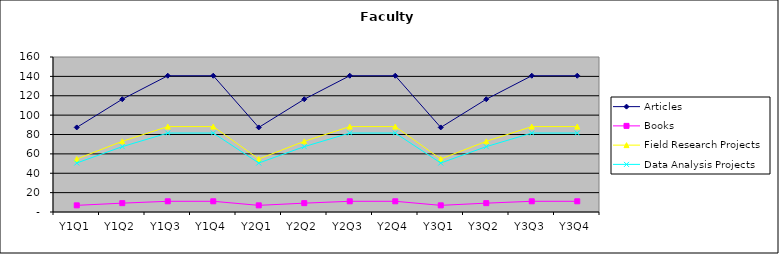
| Category | Articles  | Books  | Field Research Projects | Data Analysis Projects |
|---|---|---|---|---|
| Y1Q1 | 87.3 | 6.858 | 54.72 | 50.58 |
| Y1Q2 | 116.4 | 9.144 | 72.96 | 67.44 |
| Y1Q3 | 140.65 | 11.049 | 88.16 | 81.49 |
| Y1Q4 | 140.65 | 11.049 | 88.16 | 81.49 |
| Y2Q1 | 87.3 | 6.858 | 54.72 | 50.58 |
| Y2Q2 | 116.4 | 9.144 | 72.96 | 67.44 |
| Y2Q3 | 140.65 | 11.049 | 88.16 | 81.49 |
| Y2Q4 | 140.65 | 11.049 | 88.16 | 81.49 |
| Y3Q1 | 87.3 | 6.858 | 54.72 | 50.58 |
| Y3Q2 | 116.4 | 9.144 | 72.96 | 67.44 |
| Y3Q3 | 140.65 | 11.049 | 88.16 | 81.49 |
| Y3Q4 | 140.65 | 11.049 | 88.16 | 81.49 |